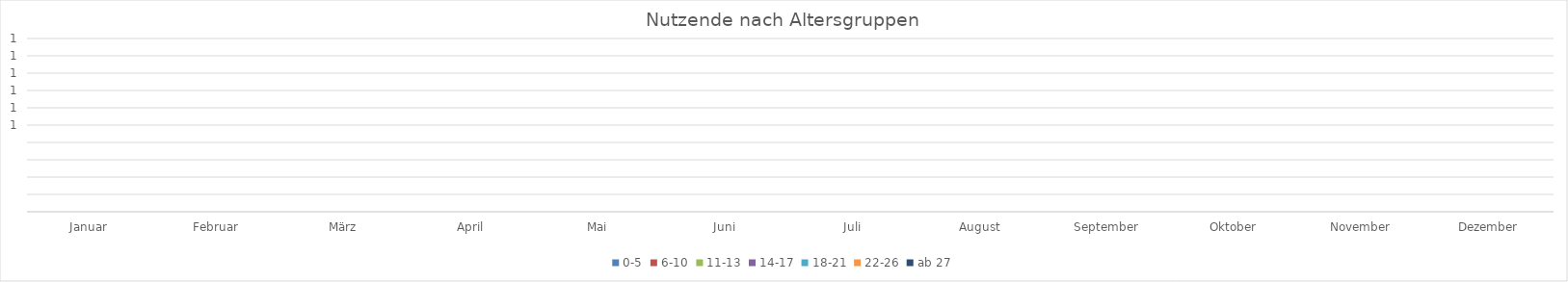
| Category | 0-5 | 6-10 | 11-13 | 14-17 | 18-21 | 22-26 | ab 27 |
|---|---|---|---|---|---|---|---|
| Januar | 0 | 0 | 0 | 0 | 0 | 0 | 0 |
| Februar | 0 | 0 | 0 | 0 | 0 | 0 | 0 |
| März | 0 | 0 | 0 | 0 | 0 | 0 | 0 |
| April | 0 | 0 | 0 | 0 | 0 | 0 | 0 |
| Mai | 0 | 0 | 0 | 0 | 0 | 0 | 0 |
| Juni | 0 | 0 | 0 | 0 | 0 | 0 | 0 |
| Juli | 0 | 0 | 0 | 0 | 0 | 0 | 0 |
| August | 0 | 0 | 0 | 0 | 0 | 0 | 0 |
| September | 0 | 0 | 0 | 0 | 0 | 0 | 0 |
| Oktober | 0 | 0 | 0 | 0 | 0 | 0 | 0 |
| November | 0 | 0 | 0 | 0 | 0 | 0 | 0 |
| Dezember | 0 | 0 | 0 | 0 | 0 | 0 | 0 |